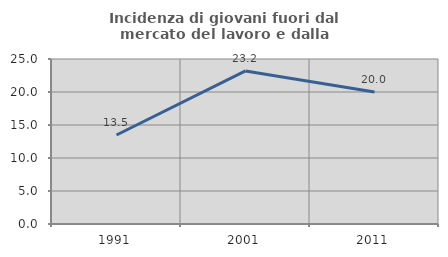
| Category | Incidenza di giovani fuori dal mercato del lavoro e dalla formazione  |
|---|---|
| 1991.0 | 13.483 |
| 2001.0 | 23.188 |
| 2011.0 | 20 |